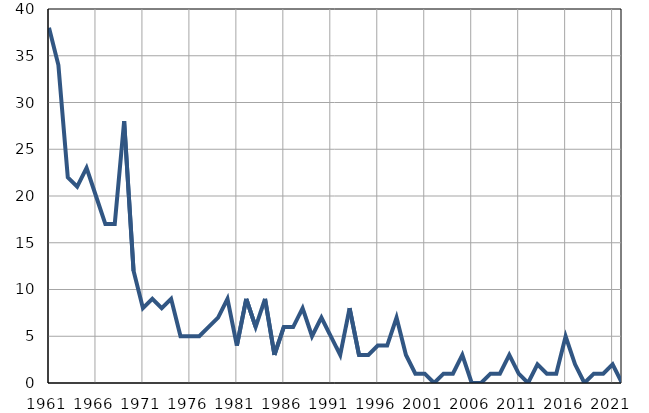
| Category | Умрла 
одојчад |
|---|---|
| 1961.0 | 38 |
| 1962.0 | 34 |
| 1963.0 | 22 |
| 1964.0 | 21 |
| 1965.0 | 23 |
| 1966.0 | 20 |
| 1967.0 | 17 |
| 1968.0 | 17 |
| 1969.0 | 28 |
| 1970.0 | 12 |
| 1971.0 | 8 |
| 1972.0 | 9 |
| 1973.0 | 8 |
| 1974.0 | 9 |
| 1975.0 | 5 |
| 1976.0 | 5 |
| 1977.0 | 5 |
| 1978.0 | 6 |
| 1979.0 | 7 |
| 1980.0 | 9 |
| 1981.0 | 4 |
| 1982.0 | 9 |
| 1983.0 | 6 |
| 1984.0 | 9 |
| 1985.0 | 3 |
| 1986.0 | 6 |
| 1987.0 | 6 |
| 1988.0 | 8 |
| 1989.0 | 5 |
| 1990.0 | 7 |
| 1991.0 | 5 |
| 1992.0 | 3 |
| 1993.0 | 8 |
| 1994.0 | 3 |
| 1995.0 | 3 |
| 1996.0 | 4 |
| 1997.0 | 4 |
| 1998.0 | 7 |
| 1999.0 | 3 |
| 2000.0 | 1 |
| 2001.0 | 1 |
| 2002.0 | 0 |
| 2003.0 | 1 |
| 2004.0 | 1 |
| 2005.0 | 3 |
| 2006.0 | 0 |
| 2007.0 | 0 |
| 2008.0 | 1 |
| 2009.0 | 1 |
| 2010.0 | 3 |
| 2011.0 | 1 |
| 2012.0 | 0 |
| 2013.0 | 2 |
| 2014.0 | 1 |
| 2015.0 | 1 |
| 2016.0 | 5 |
| 2017.0 | 2 |
| 2018.0 | 0 |
| 2019.0 | 1 |
| 2020.0 | 1 |
| 2021.0 | 2 |
| 2022.0 | 0 |